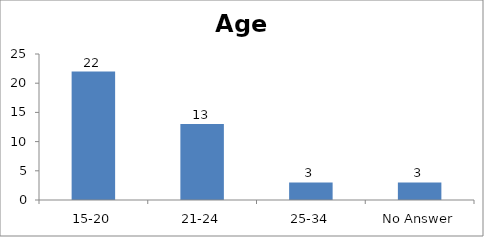
| Category | Age |
|---|---|
| 15-20 | 22 |
| 21-24 | 13 |
| 25-34 | 3 |
| No Answer | 3 |